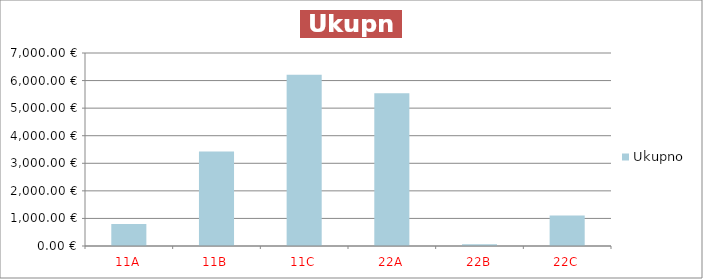
| Category | Ukupno |
|---|---|
| 11A | 800 |
| 11B | 3430 |
| 11C | 6213 |
| 22A | 5544 |
| 22B | 60 |
| 22C | 1104 |